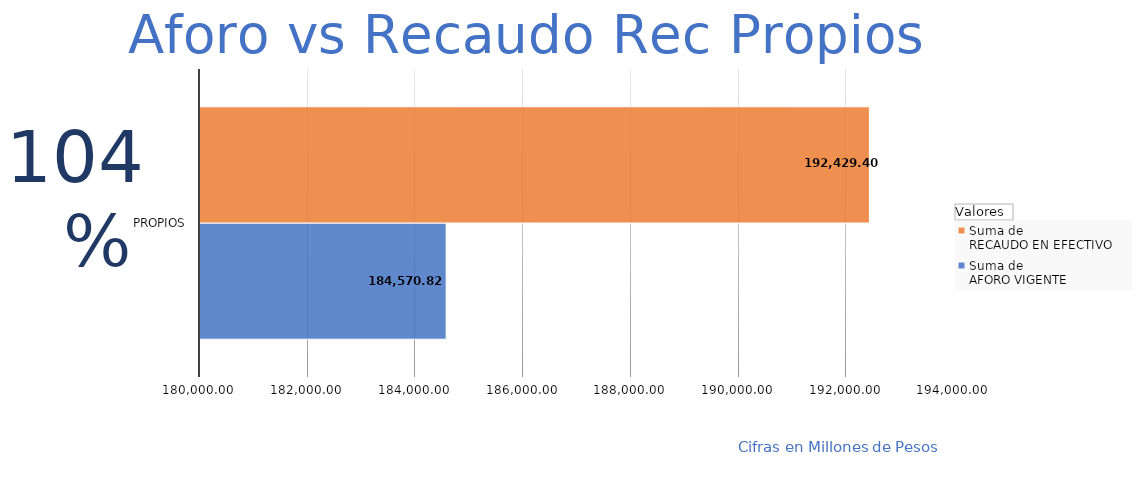
| Category | Suma de 
AFORO VIGENTE
 | Suma de 
RECAUDO EN EFECTIVO 
 |
|---|---|---|
| Propios | 184570.824 | 192429.399 |